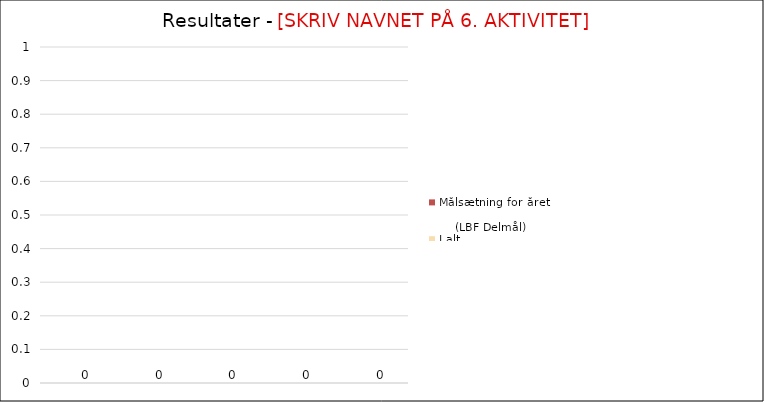
| Category | Målsætning for året                                           (LBF Delmål) | I alt 
pr. år |
|---|---|---|
|  |  | 0 |
|  |  | 0 |
|  |  | 0 |
|  |  | 0 |
|  |  | 0 |